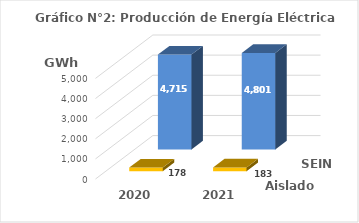
| Category | Aislados | SEIN |
|---|---|---|
| 2020.0 | 177.696 | 4715.2 |
| 2021.0 | 182.629 | 4800.936 |